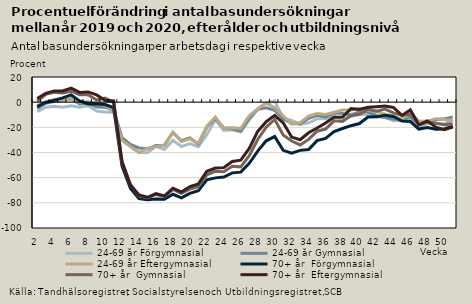
| Category | 24-69 år | 70+ år  |
|---|---|---|
| 2.0 | -2.766 | 2.883 |
| 3.0 | 0.181 | 6.973 |
| 4.0 | 1.981 | 8.953 |
| 5.0 | 1.535 | 8.843 |
| 6.0 | 2.132 | 11.168 |
| 7.0 | 0.199 | 7.754 |
| 8.0 | 0.337 | 8.125 |
| 9.0 | -1.263 | 5.75 |
| 10.0 | -2.418 | 1.513 |
| 11.0 | -6.684 | 0.975 |
| 12.0 | -30.407 | -47.225 |
| 13.0 | -35.22 | -65.993 |
| 14.0 | -40.168 | -73.819 |
| 15.0 | -36.581 | -75.608 |
| 16.0 | -35.337 | -72.596 |
| 17.0 | -33.997 | -74.553 |
| 18.0 | -24.114 | -68.368 |
| 19.0 | -31.339 | -71.34 |
| 20.0 | -29.157 | -67.044 |
| 21.0 | -32.633 | -64.927 |
| 22.0 | -19.082 | -54.899 |
| 23.0 | -11.853 | -52.307 |
| 24.0 | -20.768 | -52.027 |
| 25.0 | -20.341 | -47.117 |
| 26.0 | -20.834 | -46.135 |
| 27.0 | -10.734 | -36.707 |
| 28.0 | -5.255 | -23.241 |
| 29.0 | -0.754 | -15.509 |
| 30.0 | -4.417 | -10.493 |
| 31.0 | -10.9 | -16.42 |
| 32.0 | -17.396 | -27.754 |
| 33.0 | -16.324 | -29.843 |
| 34.0 | -10.985 | -24.291 |
| 35.0 | -9.011 | -20.563 |
| 36.0 | -9.73 | -16.587 |
| 37.0 | -7.982 | -11.925 |
| 38.0 | -6.252 | -11.781 |
| 39.0 | -6.217 | -5.172 |
| 40.0 | -5.05 | -5.815 |
| 41.0 | -6.44 | -3.996 |
| 42.0 | -7.44 | -3.58 |
| 43.0 | -9.611 | -3.132 |
| 44.0 | -10.862 | -4.221 |
| 45.0 | -13.542 | -10.522 |
| 46.0 | -8.25 | -6.06 |
| 47.0 | -15.222 | -18.008 |
| 48.0 | -15.052 | -14.893 |
| 49.0 | -13.095 | -19.912 |
| 50.0 | -13.689 | -21.87 |
| 51.0 | -14.738 | -19.852 |